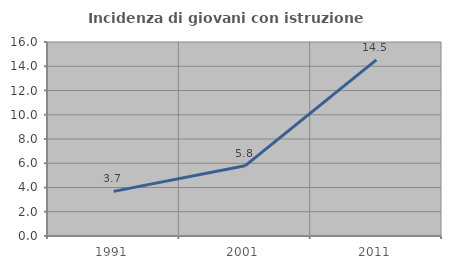
| Category | Incidenza di giovani con istruzione universitaria |
|---|---|
| 1991.0 | 3.68 |
| 2001.0 | 5.787 |
| 2011.0 | 14.532 |